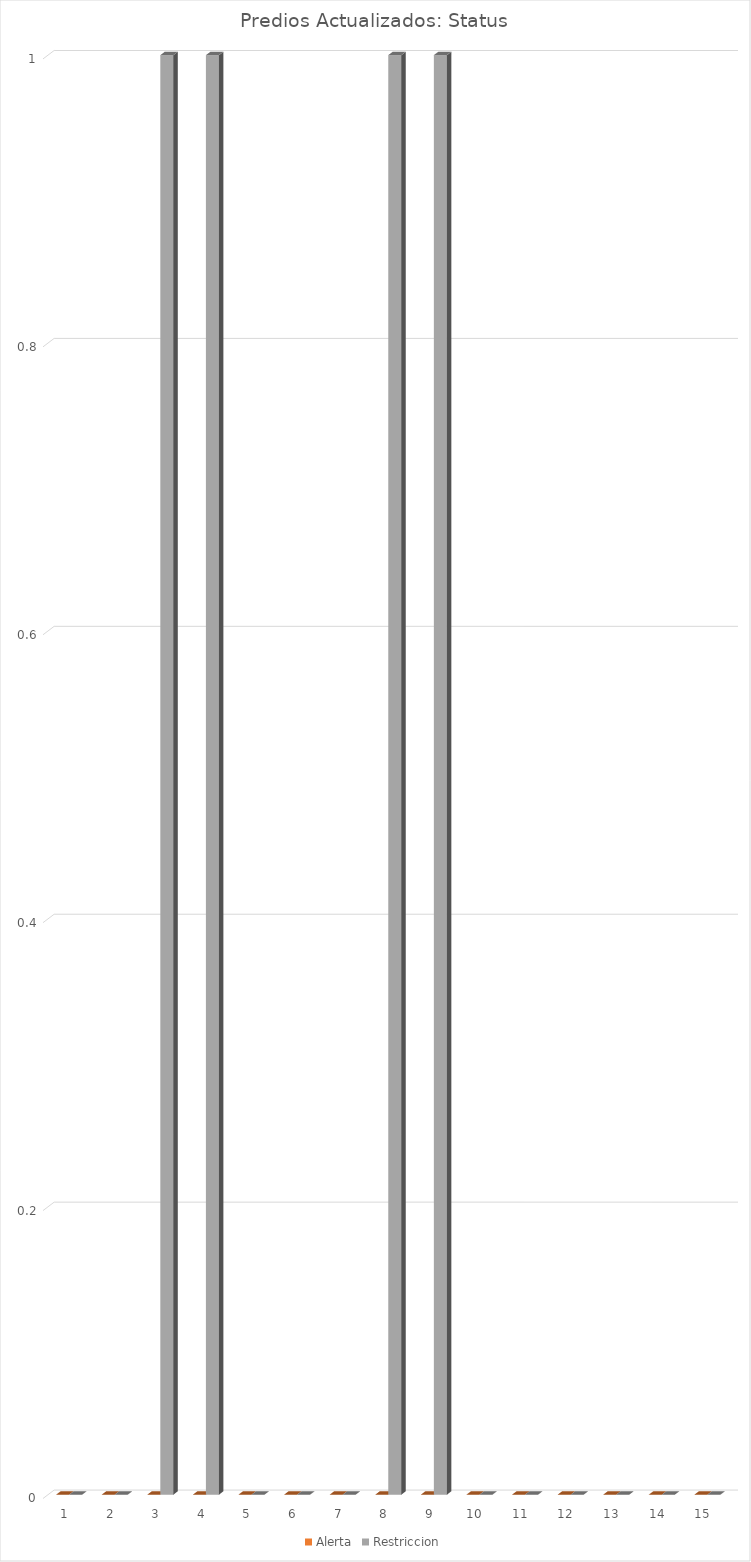
| Category | Avance | Alerta | Restriccion |
|---|---|---|---|
| 1.0 |  | 0 | 0 |
| 2.0 |  | 0 | 0 |
| 3.0 |  | 0 | 1 |
| 4.0 |  | 0 | 1 |
| 5.0 |  | 0 | 0 |
| 6.0 |  | 0 | 0 |
| 7.0 |  | 0 | 0 |
| 8.0 |  | 0 | 1 |
| 9.0 |  | 0 | 1 |
| 10.0 |  | 0 | 0 |
| 11.0 |  | 0 | 0 |
| 12.0 |  | 0 | 0 |
| 13.0 |  | 0 | 0 |
| 14.0 |  | 0 | 0 |
| 15.0 |  | 0 | 0 |